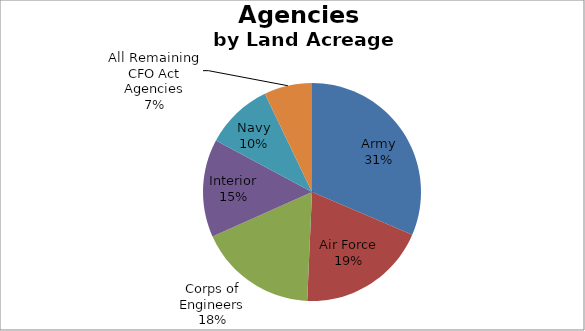
| Category | Series 0 |
|---|---|
| Army | 13719631.529 |
| Air Force | 8409287.41 |
| Corps of Engineers | 7686160.362 |
| Interior | 6338307.232 |
| Navy | 4385615.841 |
| All Remaining CFO Act Agencies | 3107354.288 |